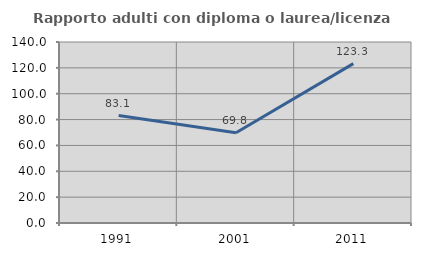
| Category | Rapporto adulti con diploma o laurea/licenza media  |
|---|---|
| 1991.0 | 83.077 |
| 2001.0 | 69.792 |
| 2011.0 | 123.288 |